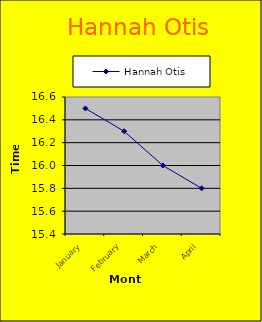
| Category | Hannah Otis |
|---|---|
| January | 16.5 |
| February | 16.3 |
| March | 16 |
| April | 15.8 |